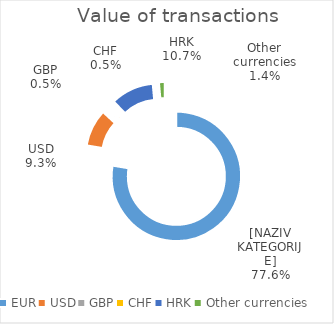
| Category | Series 0 |
|---|---|
| EUR | 193660839035 |
| USD | 23091020589 |
| GBP | 1143388970 |
| CHF | 1190565598 |
| HRK | 26731434051 |
| Other currencies | 3586264982 |